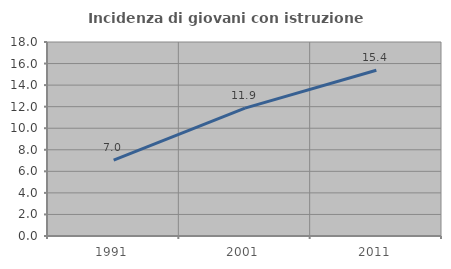
| Category | Incidenza di giovani con istruzione universitaria |
|---|---|
| 1991.0 | 7.042 |
| 2001.0 | 11.864 |
| 2011.0 | 15.385 |